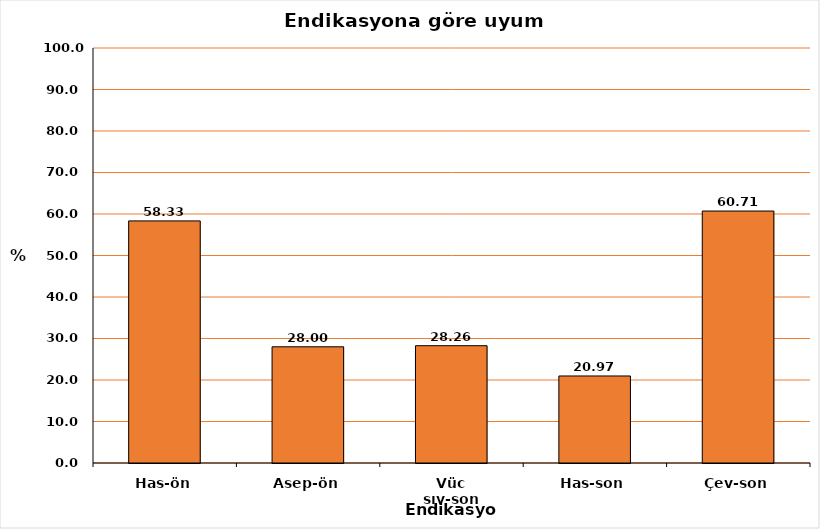
| Category | % |
|---|---|
| Has-ön | 58.333 |
| Asep-ön | 28 |
| Vüc sıv-son | 28.261 |
| Has-son | 20.968 |
| Çev-son | 60.714 |